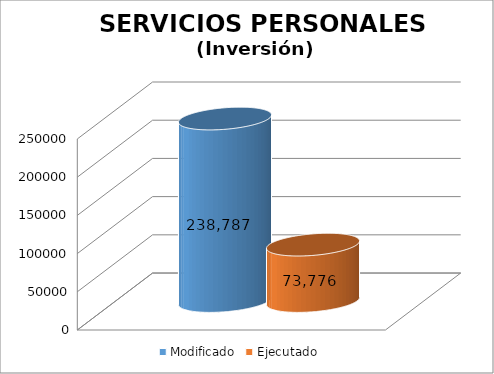
| Category | Modificado | Ejecutado |
|---|---|---|
| 0 | 238787 | 73776.18 |